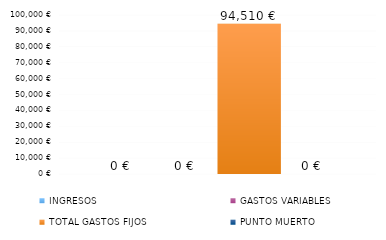
| Category | INGRESOS | GASTOS VARIABLES | TOTAL GASTOS FIJOS | PUNTO MUERTO |
|---|---|---|---|---|
| TOTAL INGRESOS  | 0 | 0 | 94510 | 0 |